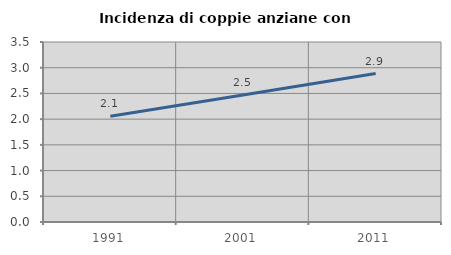
| Category | Incidenza di coppie anziane con figli |
|---|---|
| 1991.0 | 2.055 |
| 2001.0 | 2.468 |
| 2011.0 | 2.886 |